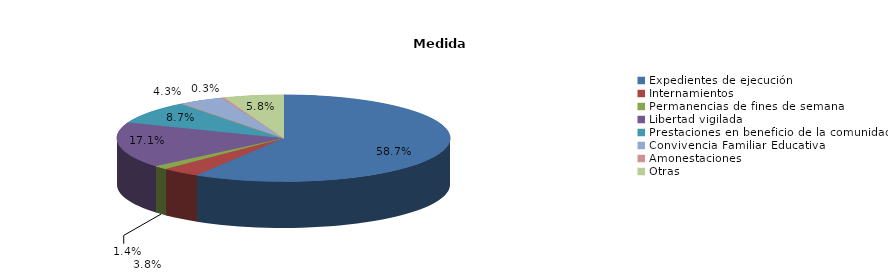
| Category | Series 0 |
|---|---|
| Expedientes de ejecución | 203 |
| Internamientos | 13 |
| Permanencias de fines de semana | 5 |
| Libertad vigilada | 59 |
| Prestaciones en beneficio de la comunidad | 30 |
| Privación de permisos y licencias | 0 |
| Convivencia Familiar Educativa | 15 |
| Amonestaciones | 1 |
| Otras | 20 |